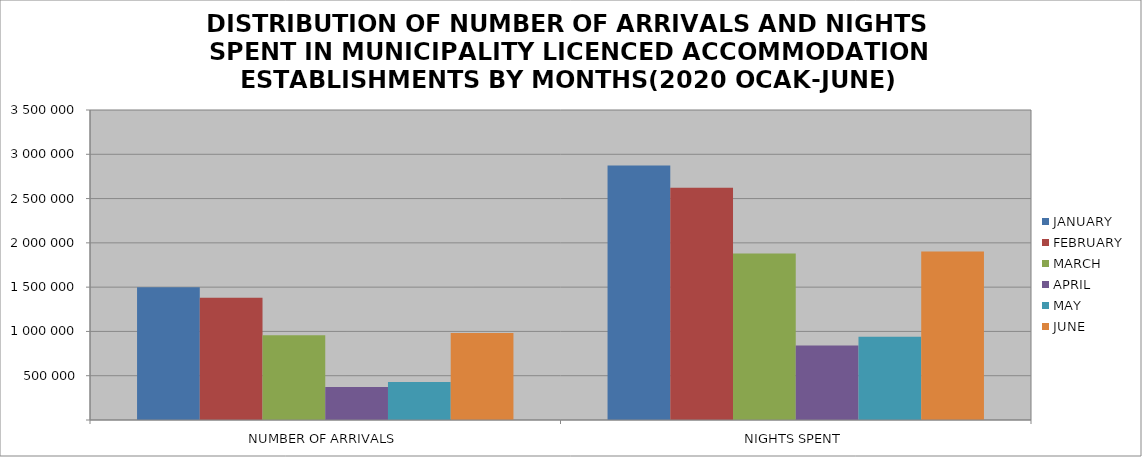
| Category | JANUARY | FEBRUARY | MARCH | APRIL | MAY | JUNE |
|---|---|---|---|---|---|---|
| NUMBER OF ARRIVALS | 1497815 | 1380765 | 955554 | 372466 | 430328 | 981538 |
| NIGHTS SPENT | 2872303 | 2621819 | 1878971 | 839735 | 939652 | 1902057 |